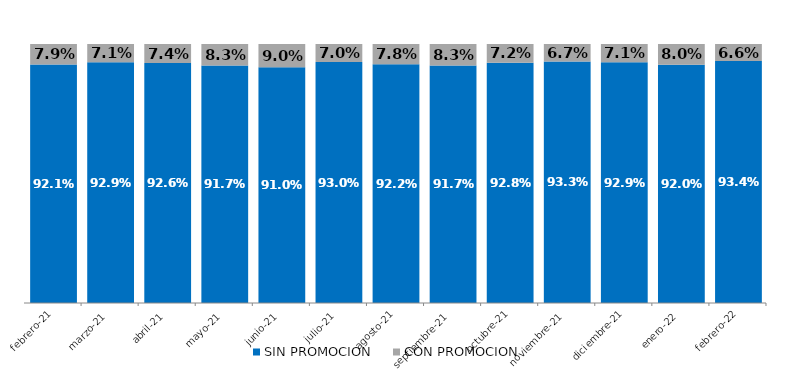
| Category | SIN PROMOCION   | CON PROMOCION   |
|---|---|---|
| 2021-02-01 | 0.921 | 0.079 |
| 2021-03-01 | 0.929 | 0.071 |
| 2021-04-01 | 0.926 | 0.074 |
| 2021-05-01 | 0.917 | 0.083 |
| 2021-06-01 | 0.91 | 0.09 |
| 2021-07-01 | 0.93 | 0.07 |
| 2021-08-01 | 0.922 | 0.078 |
| 2021-09-01 | 0.917 | 0.083 |
| 2021-10-01 | 0.928 | 0.072 |
| 2021-11-01 | 0.933 | 0.067 |
| 2021-12-01 | 0.929 | 0.071 |
| 2022-01-01 | 0.92 | 0.08 |
| 2022-02-01 | 0.934 | 0.066 |